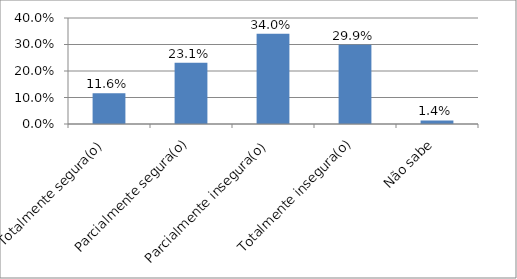
| Category | Series 0 |
|---|---|
| Totalmente segura(o) | 0.116 |
| Parcialmente segura(o) | 0.231 |
| Parcialmente insegura(o) | 0.34 |
| Totalmente insegura(o) | 0.299 |
| Não sabe | 0.014 |